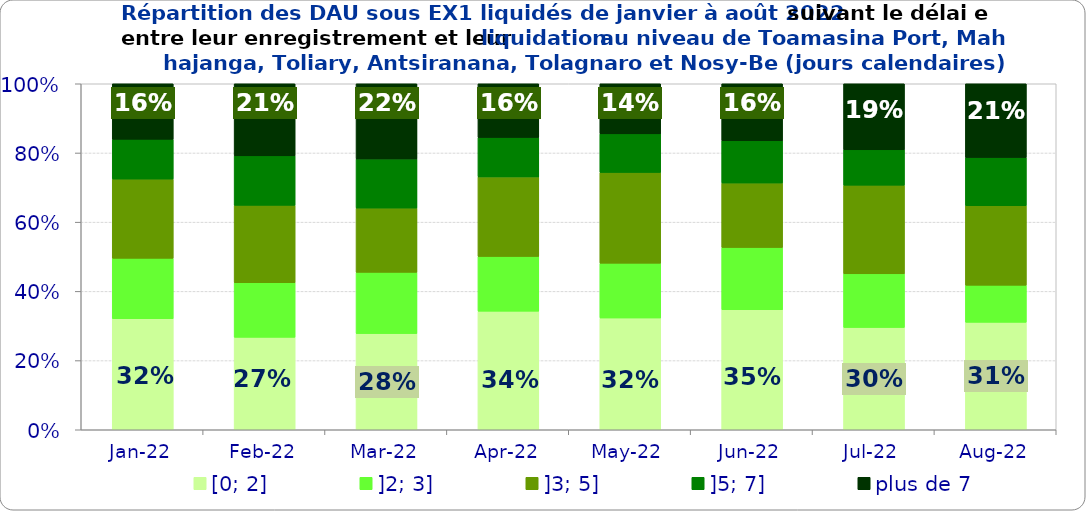
| Category | [0; 2] | ]2; 3] | ]3; 5] | ]5; 7] | plus de 7 |
|---|---|---|---|---|---|
| 2022-01-01 | 0.321 | 0.174 | 0.229 | 0.115 | 0.161 |
| 2022-02-01 | 0.267 | 0.158 | 0.223 | 0.143 | 0.208 |
| 2022-03-01 | 0.278 | 0.177 | 0.186 | 0.142 | 0.217 |
| 2022-04-01 | 0.343 | 0.158 | 0.23 | 0.114 | 0.155 |
| 2022-05-01 | 0.323 | 0.158 | 0.262 | 0.111 | 0.145 |
| 2022-06-01 | 0.347 | 0.18 | 0.186 | 0.122 | 0.165 |
| 2022-07-01 | 0.296 | 0.155 | 0.256 | 0.102 | 0.191 |
| 2022-08-01 | 0.31 | 0.107 | 0.23 | 0.139 | 0.213 |